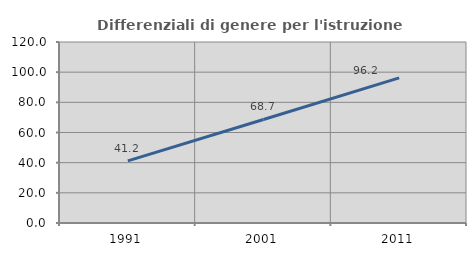
| Category | Differenziali di genere per l'istruzione superiore |
|---|---|
| 1991.0 | 41.224 |
| 2001.0 | 68.652 |
| 2011.0 | 96.199 |